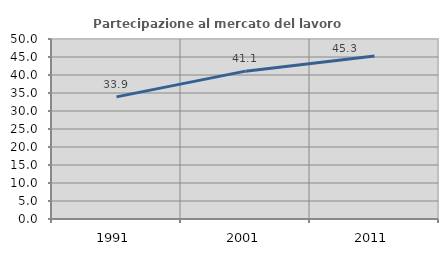
| Category | Partecipazione al mercato del lavoro  femminile |
|---|---|
| 1991.0 | 33.929 |
| 2001.0 | 41.071 |
| 2011.0 | 45.299 |